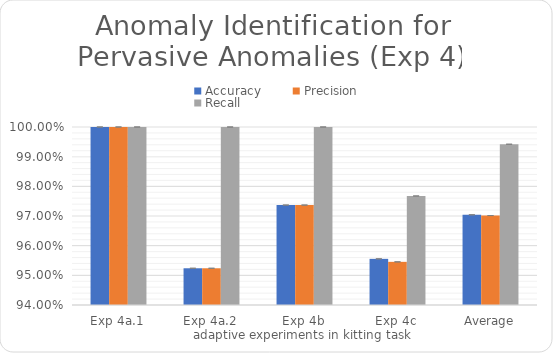
| Category | Accuracy | Precision | Recall |
|---|---|---|---|
| Exp 4a.1 | 1 | 1 | 1 |
| Exp 4a.2 | 0.952 | 0.952 | 1 |
| Exp 4b | 0.974 | 0.974 | 1 |
| Exp 4c | 0.956 | 0.955 | 0.977 |
| Average | 0.97 | 0.97 | 0.994 |